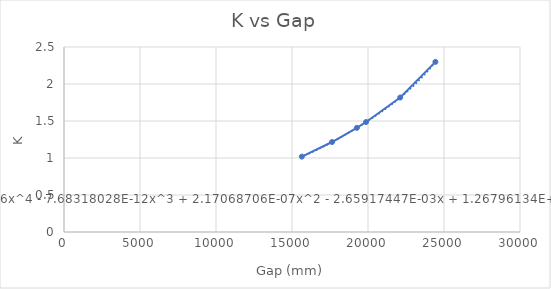
| Category | Series 0 |
|---|---|
| 15646.0 | 1.018 |
| 17636.0 | 1.216 |
| 19269.0 | 1.408 |
| 19871.0 | 1.486 |
| 22120.0 | 1.817 |
| 24435.0 | 2.299 |